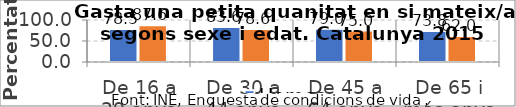
| Category | Homes | Dones |
|---|---|---|
| De 16 a 29 anys | 78.5 | 87.6 |
| De 30 a 44 anys | 83.6 | 78.6 |
| De 45 a 64 anys | 79 | 75 |
| De 65 i més anys | 73.8 | 62 |